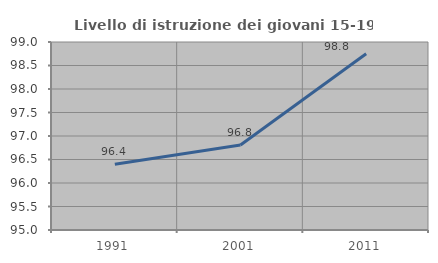
| Category | Livello di istruzione dei giovani 15-19 anni |
|---|---|
| 1991.0 | 96.398 |
| 2001.0 | 96.81 |
| 2011.0 | 98.752 |